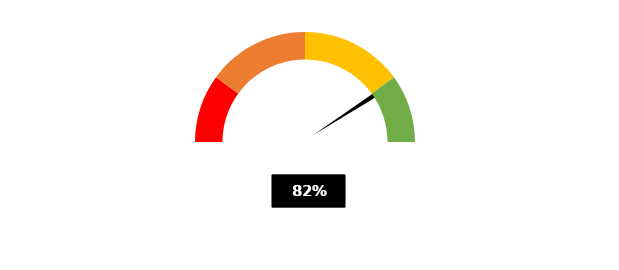
| Category | PUNTERO |
|---|---|
| 0 | 0.404 |
| 1 | 0.01 |
| 2 | 0.586 |